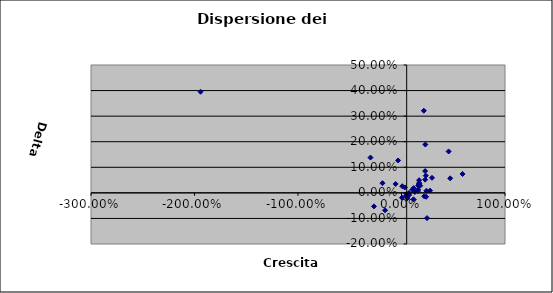
| Category | Series 0 |
|---|---|
| -0.18379648549243977 | 0.038 |
| 0.07381754444150923 | -0.008 |
| -0.03305984690456332 | 0.127 |
| 0.23472330848916312 | 0.067 |
| -1.9416102186669921 | 0.395 |
| 0.21568889482827758 | 0.321 |
| 0.22843651770386697 | 0.085 |
| 0.45562336326614994 | 0.162 |
| 0.1598376959185297 | 0.008 |
| 0.10516484542822457 | 0.013 |
| -0.1590924343266641 | -0.068 |
| -0.2997858990752029 | 0.138 |
| -0.2661306626440446 | -0.053 |
| 0.004495989104456699 | -0.019 |
| 0.17164304111487794 | 0.037 |
| 0.29480080385713414 | 0.059 |
| 0.16995995247106466 | 0.05 |
| -0.05689273098273251 | 0.035 |
| 0.15941285728828714 | 0.013 |
| 0.4705380017079419 | 0.057 |
| 0.1282430064070026 | 0.003 |
| 0.21971285478311375 | -0.014 |
| 0.18071350677675646 | 0.028 |
| 0.04835766423357657 | -0.004 |
| 0.22848720976725567 | 0.052 |
| 0.23761125641623115 | -0.016 |
| 0.056961288897652285 | -0.021 |
| 0.07239933391086506 | 0 |
| 0.03154305200341012 | 0.021 |
| 0.006890503633174561 | 0.026 |
| 0.17006577104505372 | 0.038 |
| 0.2760019083969465 | 0.009 |
| 0.24642857142857144 | -0.099 |
| 0.16118109169714212 | 0.029 |
| 0.11783088444186873 | 0.019 |
| 0.04191224623444656 | -0.012 |
| 0.5899506822911977 | 0.074 |
| 0.11601172139153948 | -0.025 |
| 0.23022333542058027 | 0.189 |
| 0.24085031777339472 | 0.008 |